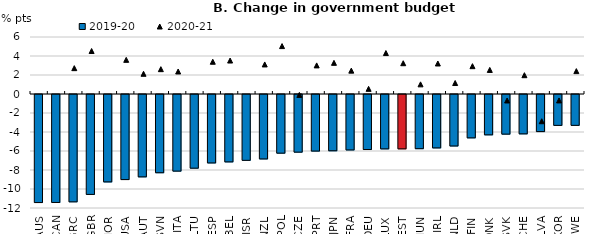
| Category | 2019-20 |
|---|---|
| AUS | -11.377 |
| CAN | -11.365 |
| GRC | -11.301 |
| GBR | -10.517 |
| NOR | -9.198 |
| USA | -8.958 |
| AUT | -8.67 |
| SVN | -8.236 |
| ITA | -8.064 |
| LTU | -7.755 |
| ESP | -7.205 |
| BEL | -7.095 |
| ISR | -6.93 |
| NZL | -6.784 |
| POL | -6.175 |
| CZE | -6.068 |
| PRT | -5.955 |
| JPN | -5.924 |
| FRA | -5.837 |
| DEU | -5.791 |
| LUX | -5.724 |
| EST | -5.721 |
| HUN | -5.704 |
| IRL | -5.623 |
| NLD | -5.419 |
| FIN | -4.565 |
| DNK | -4.247 |
| SVK | -4.172 |
| CHE | -4.144 |
| LVA | -3.904 |
| KOR | -3.25 |
| SWE | -3.247 |